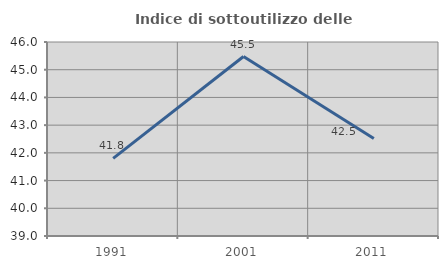
| Category | Indice di sottoutilizzo delle abitazioni  |
|---|---|
| 1991.0 | 41.802 |
| 2001.0 | 45.476 |
| 2011.0 | 42.517 |